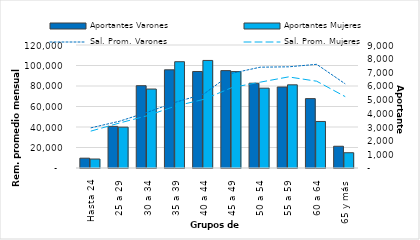
| Category | Aportantes Varones | Aportantes Mujeres |
|---|---|---|
| 0 | 719 | 657 |
| 1 | 3046 | 2990 |
| 2 | 6022 | 5778 |
| 3 | 7184 | 7777 |
| 4 | 7061 | 7870 |
| 5 | 7126 | 7053 |
| 6 | 6204 | 5840 |
| 7 | 5927 | 6086 |
| 8 | 5077 | 3405 |
| 9 | 1591 | 1118 |